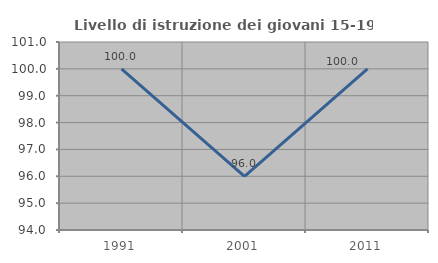
| Category | Livello di istruzione dei giovani 15-19 anni |
|---|---|
| 1991.0 | 100 |
| 2001.0 | 96 |
| 2011.0 | 100 |